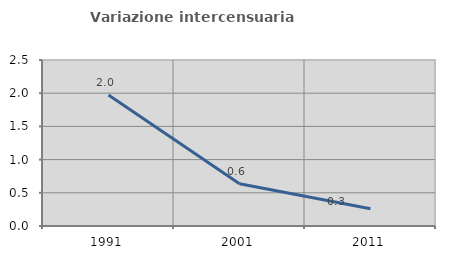
| Category | Variazione intercensuaria annua |
|---|---|
| 1991.0 | 1.974 |
| 2001.0 | 0.635 |
| 2011.0 | 0.261 |